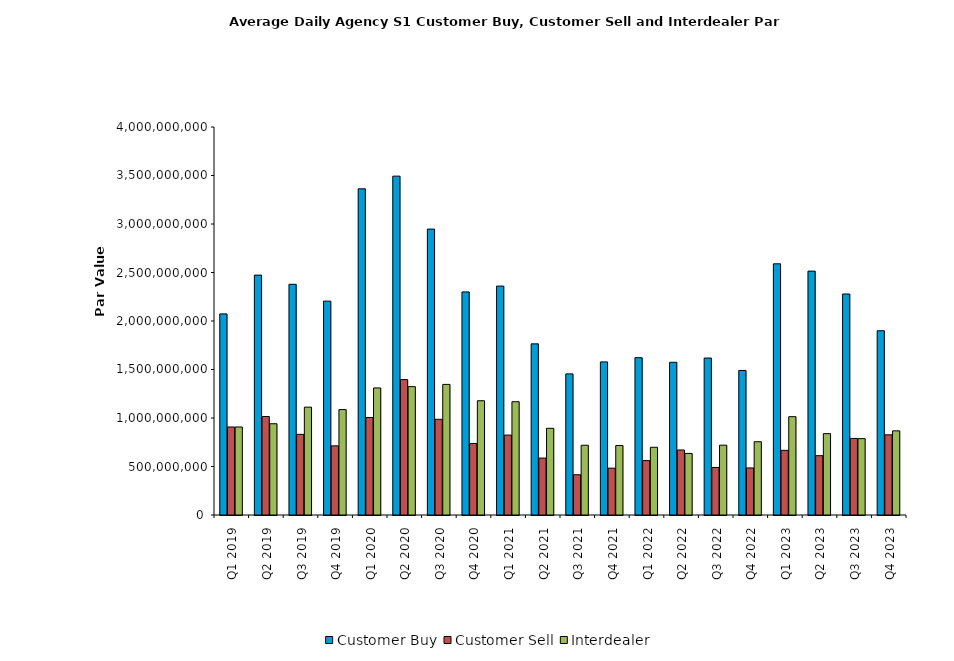
| Category | Customer Buy | Customer Sell | Interdealer |
|---|---|---|---|
| Q1 2019 | 2073261289.88 | 907510641.636 | 907260794.476 |
| Q2 2019 | 2473016544.594 | 1015360883.633 | 940855570.046 |
| Q3 2019 | 2378240723.661 | 831622963.177 | 1111864355.118 |
| Q4 2019 | 2204844278.563 | 712918478.978 | 1086841151.009 |
| Q1 2020 | 3362551755.186 | 1004751117.532 | 1309827535.649 |
| Q2 2020 | 3493551277.386 | 1395918416.507 | 1323386792.52 |
| Q3 2020 | 2947577049.279 | 986470577.23 | 1346329562.976 |
| Q4 2020 | 2299861782.395 | 736719021.503 | 1177913333.868 |
| Q1 2021 | 2359997883.405 | 823688579.746 | 1167873739.582 |
| Q2 2021 | 1764193861.289 | 586671797.083 | 893791433.931 |
| Q3 2021 | 1454835444.617 | 415056304.899 | 719075537.285 |
| Q4 2021 | 1578222361.26 | 483014882.953 | 716584342.958 |
| Q1 2022 | 1621678828.378 | 561118720.592 | 698191226.356 |
| Q2 2022 | 1574211173.599 | 670203829.293 | 634597449.719 |
| Q3 2022 | 1618094858.503 | 489928924.408 | 719984663.767 |
| Q4 2022 | 1490322906.815 | 485222833.849 | 755328901.37 |
| Q1 2023 | 2589533352.954 | 666542175.885 | 1013684268.885 |
| Q2 2023 | 2514254327.42 | 611589628.457 | 838828120.331 |
| Q3 2023 | 2278488685.454 | 789191062.869 | 787351436.851 |
| Q4 2023 | 1899633771.137 | 826606527.032 | 867444812.211 |